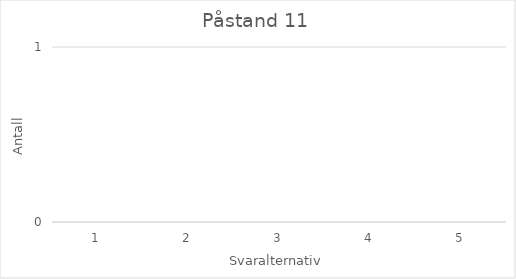
| Category | Series 0 |
|---|---|
| 1.0 | 0 |
| 2.0 | 0 |
| 3.0 | 0 |
| 4.0 | 0 |
| 5.0 | 0 |